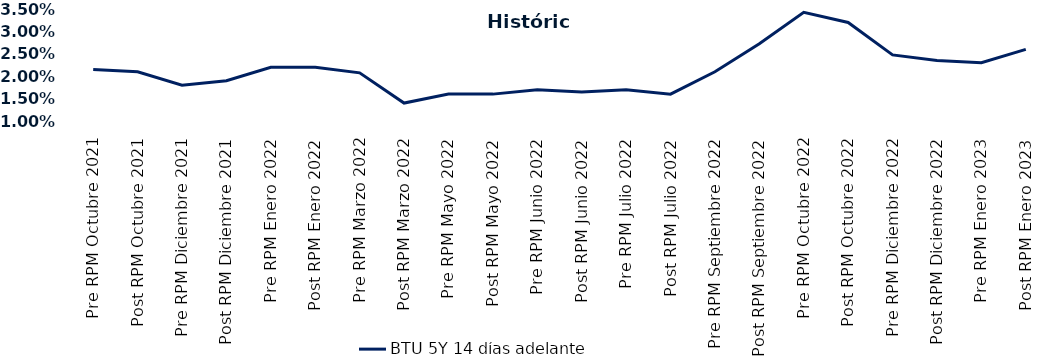
| Category | BTU 5Y 14 días adelante |
|---|---|
| Pre RPM Octubre 2021 | 0.022 |
| Post RPM Octubre 2021 | 0.021 |
| Pre RPM Diciembre 2021 | 0.018 |
| Post RPM Diciembre 2021 | 0.019 |
| Pre RPM Enero 2022 | 0.022 |
| Post RPM Enero 2022 | 0.022 |
| Pre RPM Marzo 2022 | 0.021 |
| Post RPM Marzo 2022 | 0.014 |
| Pre RPM Mayo 2022 | 0.016 |
| Post RPM Mayo 2022 | 0.016 |
| Pre RPM Junio 2022 | 0.017 |
| Post RPM Junio 2022 | 0.016 |
| Pre RPM Julio 2022 | 0.017 |
| Post RPM Julio 2022 | 0.016 |
| Pre RPM Septiembre 2022 | 0.021 |
| Post RPM Septiembre 2022 | 0.027 |
| Pre RPM Octubre 2022 | 0.034 |
| Post RPM Octubre 2022 | 0.032 |
| Pre RPM Diciembre 2022 | 0.025 |
| Post RPM Diciembre 2022 | 0.024 |
| Pre RPM Enero 2023 | 0.023 |
| Post RPM Enero 2023 | 0.026 |